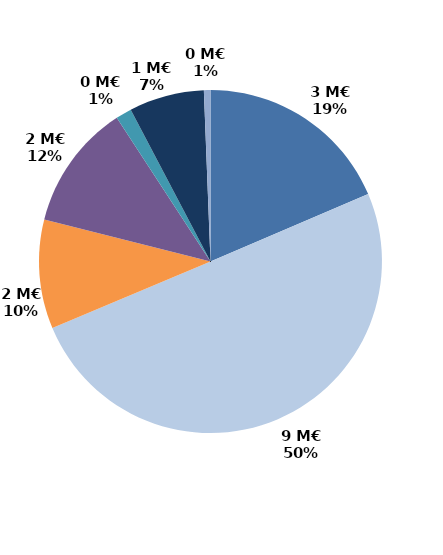
| Category | Series 0 |
|---|---|
| Accueil et information (CEP 1) | 3.346 |
| Accompagnement renforcé (CEP 2 et 3) | 9.026 |
| Suivi | 1.852 |
| Missions locales | 2.136 |
| CSP | 0.271 |
| Aide à la création d'entreprise | 1.276 |
| Aide à l'insertion | 0.111 |